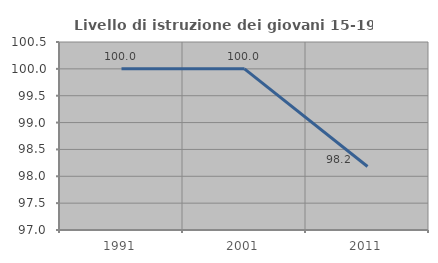
| Category | Livello di istruzione dei giovani 15-19 anni |
|---|---|
| 1991.0 | 100 |
| 2001.0 | 100 |
| 2011.0 | 98.182 |